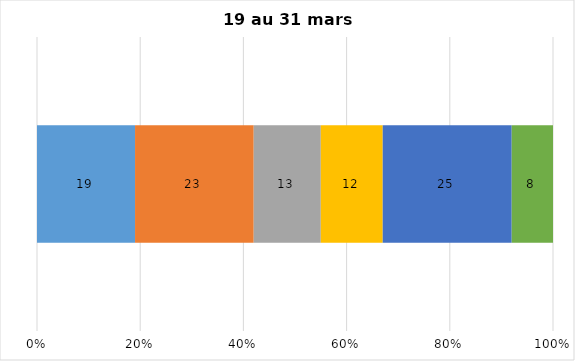
| Category | Plusieurs fois par jour | Une fois par jour | Quelques fois par semaine   | Une fois par semaine ou moins   |  Jamais   |  Je n’utilise pas les médias sociaux |
|---|---|---|---|---|---|---|
| 0 | 19 | 23 | 13 | 12 | 25 | 8 |